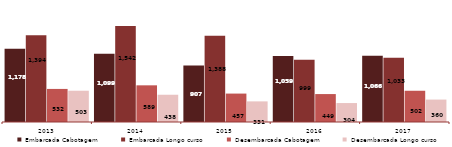
| Category | Embarcada Cabotagem | Embarcada Longo curso | Desembarcada Cabotagem | Desembarcada Longo curso |
|---|---|---|---|---|
| 2013.0 | 1177847 | 1393587 | 531531 | 502556 |
| 2014.0 | 1098704 | 1541938 | 589370 | 438078 |
| 2015.0 | 906943 | 1387987 | 456801 | 331358 |
| 2016.0 | 1059421 | 999271 | 448974 | 304491 |
| 2017.0 | 1065933 | 1032640 | 502091 | 360467 |